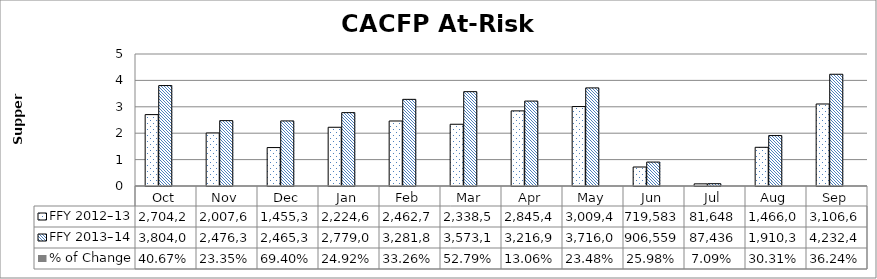
| Category | FFY 2012–13 | FFY 2013–14 | % of Change |
|---|---|---|---|
| Oct | 2704207 | 3804048 | 0.407 |
| Nov | 2007606 | 2476315 | 0.233 |
| Dec | 1455385 | 2465379 | 0.694 |
| Jan | 2224606 | 2779005 | 0.249 |
| Feb | 2462706 | 3281866 | 0.333 |
| Mar | 2338579 | 3573121 | 0.528 |
| Apr | 2845417 | 3216977 | 0.131 |
| May | 3009400 | 3716023 | 0.235 |
| Jun | 719583 | 906559 | 0.26 |
| Jul | 81648 | 87436 | 0.071 |
| Aug | 1466018 | 1910372 | 0.303 |
| Sep | 3106635 | 4232428 | 0.362 |